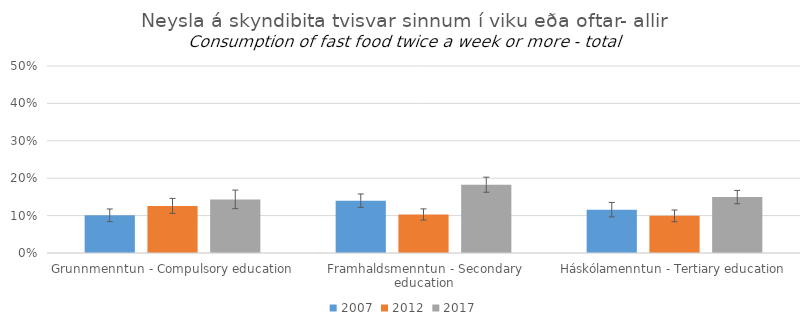
| Category | 2007 | 2012 | 2017 |
|---|---|---|---|
| Grunnmenntun - Compulsory education | 0.101 | 0.126 | 0.143 |
| Framhaldsmenntun - Secondary education | 0.14 | 0.103 | 0.183 |
| Háskólamenntun - Tertiary education | 0.116 | 0.099 | 0.149 |